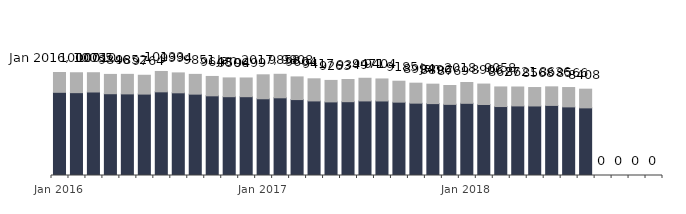
| Category |  SGB II |  SGB III |
|---|---|---|
| Jan 2016 | 8102 | 1933 |
|  | 8069 | 1938 |
|  | 8134 | 1876 |
|  | 7965 | 1881 |
|  | 7949 | 1903 |
|  | 7929 | 1835 |
|  | 8149 | 1984 |
|  | 8054 | 1940 |
|  | 7924 | 1927 |
|  | 7761 | 1887 |
|  | 7676 | 1830 |
|  | 7676 | 1823 |
| Jan 2017 | 7475 | 2333 |
|  | 7568 | 2290 |
|  | 7395 | 2209 |
|  | 7264 | 2153 |
|  | 7169 | 2094 |
|  | 7189 | 2160 |
|  | 7264 | 2207 |
|  | 7260 | 2144 |
|  | 7145 | 2040 |
|  | 7047 | 1947 |
|  | 7003 | 1893 |
|  | 6929 | 1840 |
| Jan 2018 | 7031 | 2027 |